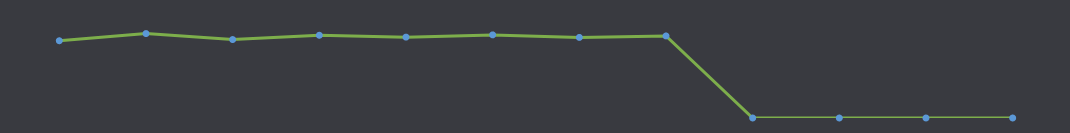
| Category | Доступні кошти |
|---|---|
| СІЧ | 4500 |
| ЛЮТ | 4917 |
| БЕР | 4570 |
| КВІ | 4819 |
| ТРА | 4711 |
| ЧЕР | 4842 |
| ЛИП | 4695 |
| СЕР | 4780 |
| ВЕР | 0 |
| ЖОВ | 0 |
| ЛИС | 0 |
| ГРУ | 0 |